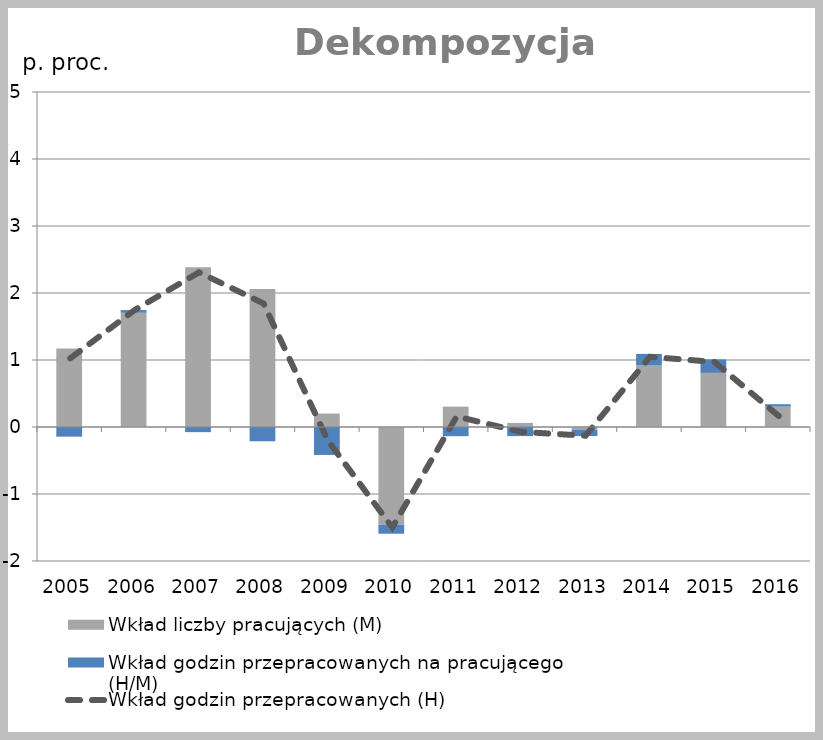
| Category | Wkład liczby pracujących (M) | Wkład godzin przepracowanych na pracującego (H/M) |
|---|---|---|
| 2005.0 | 1.17 | -0.144 |
| 2006.0 | 1.705 | 0.04 |
| 2007.0 | 2.385 | -0.077 |
| 2008.0 | 2.058 | -0.213 |
| 2009.0 | 0.201 | -0.417 |
| 2010.0 | -1.456 | -0.137 |
| 2011.0 | 0.304 | -0.137 |
| 2012.0 | 0.061 | -0.136 |
| 2013.0 | -0.038 | -0.096 |
| 2014.0 | 0.918 | 0.173 |
| 2015.0 | 0.808 | 0.201 |
| 2016.0 | 0.305 | 0.035 |